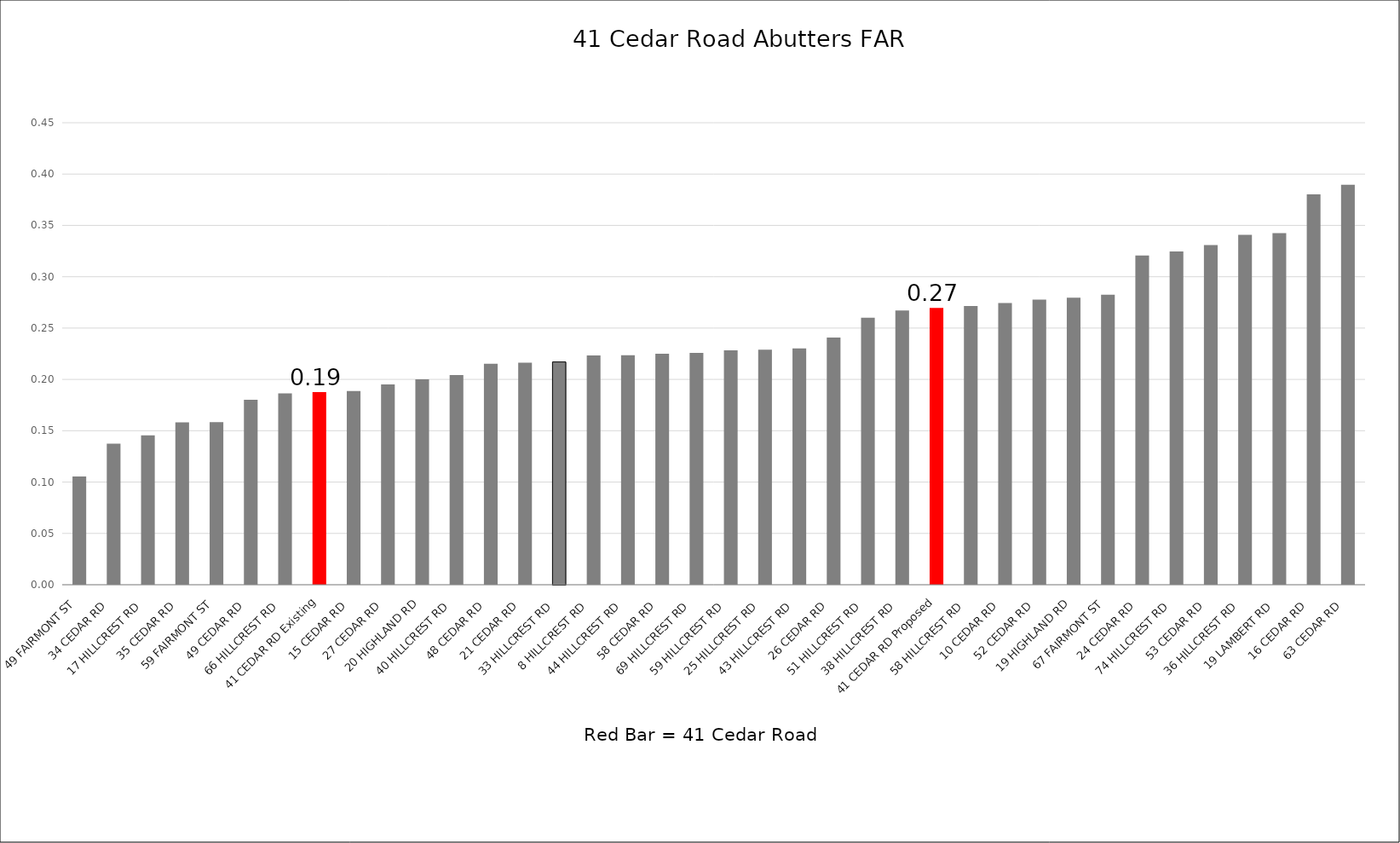
| Category | FAR |
|---|---|
| 49 FAIRMONT ST  | 0.105 |
| 34 CEDAR RD  | 0.137 |
| 17 HILLCREST RD  | 0.145 |
| 35 CEDAR RD  | 0.158 |
| 59 FAIRMONT ST  | 0.158 |
| 49 CEDAR RD  | 0.18 |
| 66 HILLCREST RD  | 0.186 |
| 41 CEDAR RD Existing | 0.188 |
| 15 CEDAR RD  | 0.189 |
| 27 CEDAR RD  | 0.195 |
| 20 HIGHLAND RD  | 0.2 |
| 40 HILLCREST RD  | 0.204 |
| 48 CEDAR RD  | 0.215 |
| 21 CEDAR RD  | 0.216 |
| 33 HILLCREST RD  | 0.217 |
| 8 HILLCREST RD  | 0.223 |
| 44 HILLCREST RD  | 0.224 |
| 58 CEDAR RD  | 0.225 |
| 69 HILLCREST RD  | 0.226 |
| 59 HILLCREST RD  | 0.228 |
| 25 HILLCREST RD  | 0.229 |
| 43 HILLCREST RD  | 0.23 |
| 26 CEDAR RD  | 0.241 |
| 51 HILLCREST RD  | 0.26 |
| 38 HILLCREST RD  | 0.267 |
| 41 CEDAR RD Proposed | 0.27 |
| 58 HILLCREST RD  | 0.272 |
| 10 CEDAR RD  | 0.274 |
| 52 CEDAR RD  | 0.278 |
| 19 HIGHLAND RD  | 0.28 |
| 67 FAIRMONT ST  | 0.282 |
| 24 CEDAR RD  | 0.321 |
| 74 HILLCREST RD  | 0.325 |
| 53 CEDAR RD  | 0.331 |
| 36 HILLCREST RD  | 0.341 |
| 19 LAMBERT RD  | 0.342 |
| 16 CEDAR RD  | 0.38 |
| 63 CEDAR RD  | 0.39 |